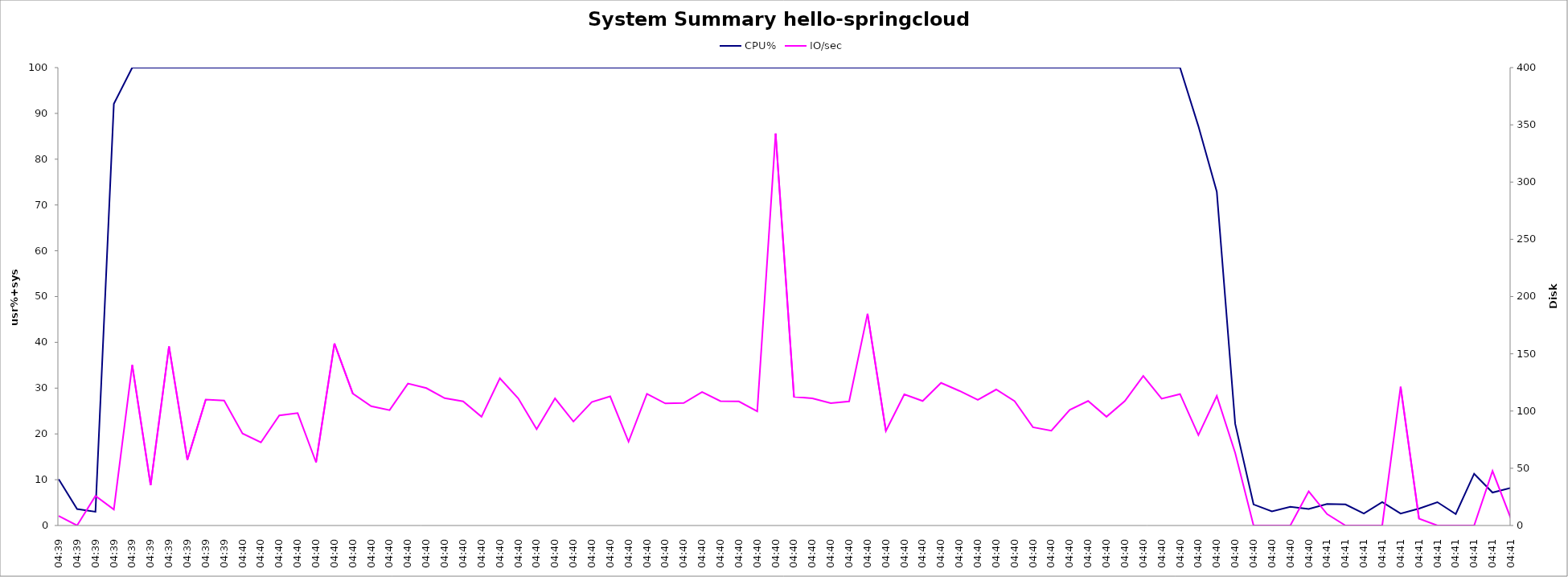
| Category | CPU% |
|---|---|
| 04:39 | 10.1 |
| 04:39 | 3.6 |
| 04:39 | 3 |
| 04:39 | 92.1 |
| 04:39 | 100 |
| 04:39 | 100 |
| 04:39 | 100 |
| 04:39 | 100 |
| 04:39 | 100 |
| 04:39 | 100 |
| 04:40 | 100 |
| 04:40 | 100 |
| 04:40 | 100 |
| 04:40 | 100 |
| 04:40 | 100 |
| 04:40 | 100 |
| 04:40 | 100 |
| 04:40 | 100 |
| 04:40 | 100 |
| 04:40 | 100 |
| 04:40 | 100 |
| 04:40 | 100 |
| 04:40 | 100 |
| 04:40 | 100 |
| 04:40 | 100 |
| 04:40 | 100 |
| 04:40 | 100 |
| 04:40 | 100 |
| 04:40 | 100 |
| 04:40 | 100 |
| 04:40 | 100 |
| 04:40 | 100 |
| 04:40 | 100 |
| 04:40 | 100 |
| 04:40 | 100 |
| 04:40 | 100 |
| 04:40 | 100 |
| 04:40 | 100 |
| 04:40 | 100 |
| 04:40 | 100 |
| 04:40 | 100 |
| 04:40 | 100 |
| 04:40 | 100 |
| 04:40 | 100 |
| 04:40 | 100 |
| 04:40 | 100 |
| 04:40 | 100 |
| 04:40 | 100 |
| 04:40 | 100 |
| 04:40 | 100 |
| 04:40 | 100 |
| 04:40 | 100 |
| 04:40 | 100 |
| 04:40 | 100 |
| 04:40 | 100 |
| 04:40 | 100 |
| 04:40 | 100 |
| 04:40 | 100 |
| 04:40 | 100 |
| 04:40 | 100 |
| 04:40 | 100 |
| 04:40 | 100 |
| 04:40 | 87.2 |
| 04:40 | 72.9 |
| 04:40 | 22.2 |
| 04:40 | 4.6 |
| 04:40 | 3.1 |
| 04:40 | 4.1 |
| 04:40 | 3.6 |
| 04:41 | 4.7 |
| 04:41 | 4.6 |
| 04:41 | 2.6 |
| 04:41 | 5.1 |
| 04:41 | 2.6 |
| 04:41 | 3.7 |
| 04:41 | 5.1 |
| 04:41 | 2.5 |
| 04:41 | 11.3 |
| 04:41 | 7.2 |
| 04:41 | 8.2 |